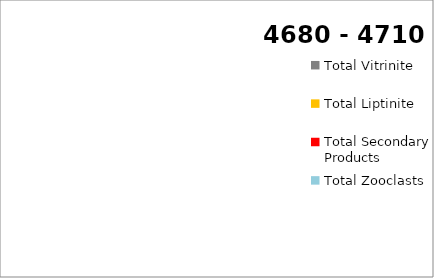
| Category | Series 4 |
|---|---|
| Total Vitrinite | 0 |
| Total Liptinite | 0 |
| Total  Inertinite | 0 |
| Total Secondary Products | 0 |
| Total Zooclasts | 0 |